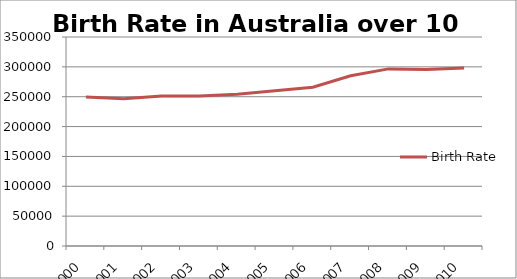
| Category | Birth Rate |
|---|---|
| 2000.0 | 249600 |
| 2001.0 | 246400 |
| 2002.0 | 251000 |
| 2003.0 | 251200 |
| 2004.0 | 254300 |
| 2005.0 | 259800 |
| 2006.0 | 266000 |
| 2007.0 | 285200 |
| 2008.0 | 296600 |
| 2009.0 | 295700 |
| 2010.0 | 297900 |